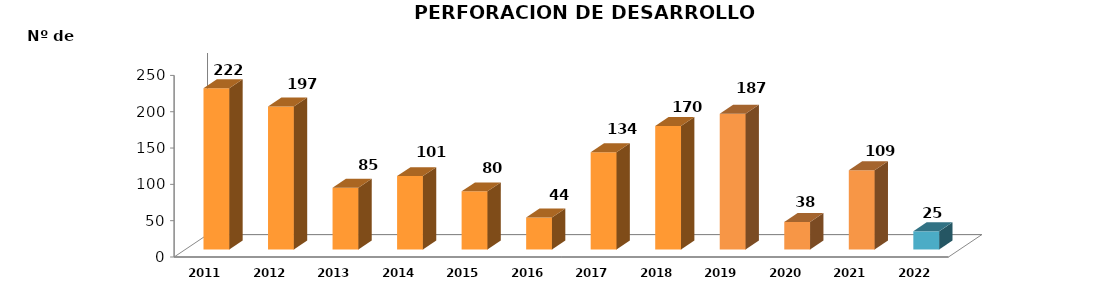
| Category | Series 0 |
|---|---|
| 2011.0 | 222 |
| 2012.0 | 197 |
| 2013.0 | 85 |
| 2014.0 | 101 |
| 2015.0 | 80 |
| 2016.0 | 44 |
| 2017.0 | 134 |
| 2018.0 | 170 |
| 2019.0 | 187 |
| 2020.0 | 38 |
| 2021.0 | 109 |
| 2022.0 | 25 |